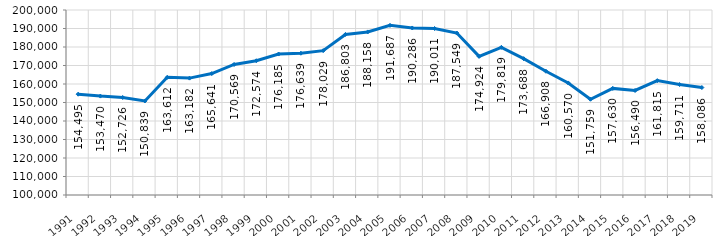
| Category | Series 0 |
|---|---|
| 1991 | 154494.783 |
| 1992 | 153469.878 |
| 1993 | 152725.605 |
| 1994 | 150839.05 |
| 1995 | 163612.412 |
| 1996 | 163182.303 |
| 1997 | 165640.543 |
| 1998 | 170569.409 |
| 1999 | 172574.159 |
| 2000 | 176185.338 |
| 2001 | 176639.274 |
| 2002 | 178029.171 |
| 2003 | 186803.422 |
| 2004 | 188158.467 |
| 2005 | 191686.53 |
| 2006 | 190285.894 |
| 2007 | 190011.376 |
| 2008 | 187549.222 |
| 2009 | 174923.555 |
| 2010 | 179819.191 |
| 2011 | 173688.362 |
| 2012 | 166908.125 |
| 2013 | 160570.376 |
| 2014 | 151758.638 |
| 2015 | 157629.547 |
| 2016 | 156490.332 |
| 2017 | 161815.269 |
| 2018 | 159710.888 |
| 2019 | 158086.438 |